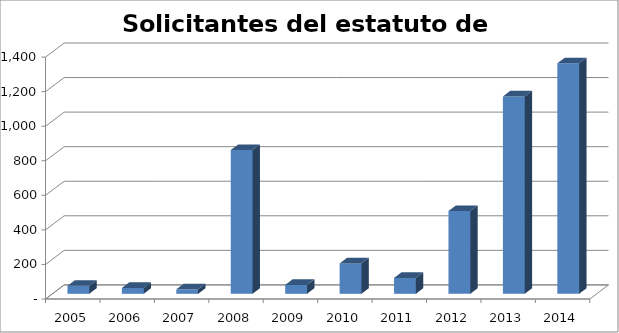
| Category | Solicitantes |
|---|---|
| 2005.0 | 46 |
| 2006.0 | 34 |
| 2007.0 | 26 |
| 2008.0 | 832 |
| 2009.0 | 51 |
| 2010.0 | 176 |
| 2011.0 | 92 |
| 2012.0 | 479 |
| 2013.0 | 1142 |
| 2014.0 | 1334 |